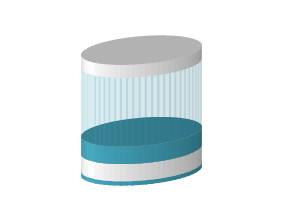
| Category | Series 0 | Series 1 | Series 2 | Series 3 | Series 4 |
|---|---|---|---|---|---|
| تهران | 0.05 | 0.2 | 0.204 | 0.796 | 0.15 |